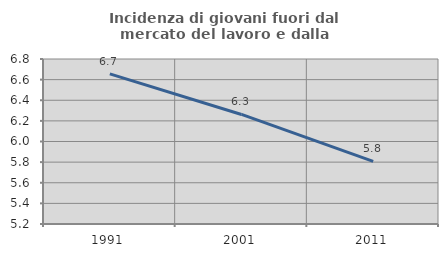
| Category | Incidenza di giovani fuori dal mercato del lavoro e dalla formazione  |
|---|---|
| 1991.0 | 6.655 |
| 2001.0 | 6.262 |
| 2011.0 | 5.808 |